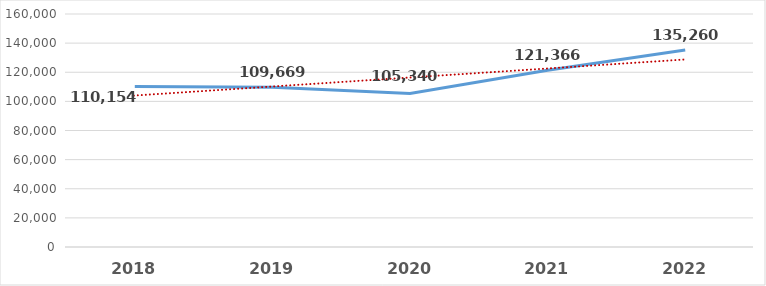
| Category | Series 0 |
|---|---|
| 2018.0 | 110154 |
| 2019.0 | 109669 |
| 2020.0 | 105340 |
| 2021.0 | 121366.353 |
| 2022.0 | 135259.872 |